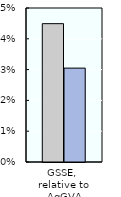
| Category | 2000-02 | 2018-20 |
|---|---|---|
| GSSE, 
relative to AgGVA | 0.045 | 0.03 |